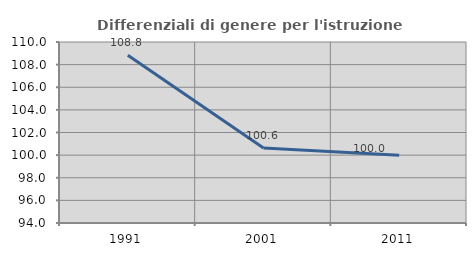
| Category | Differenziali di genere per l'istruzione superiore |
|---|---|
| 1991.0 | 108.834 |
| 2001.0 | 100.626 |
| 2011.0 | 99.999 |